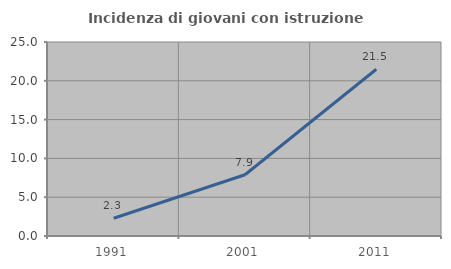
| Category | Incidenza di giovani con istruzione universitaria |
|---|---|
| 1991.0 | 2.286 |
| 2001.0 | 7.895 |
| 2011.0 | 21.488 |